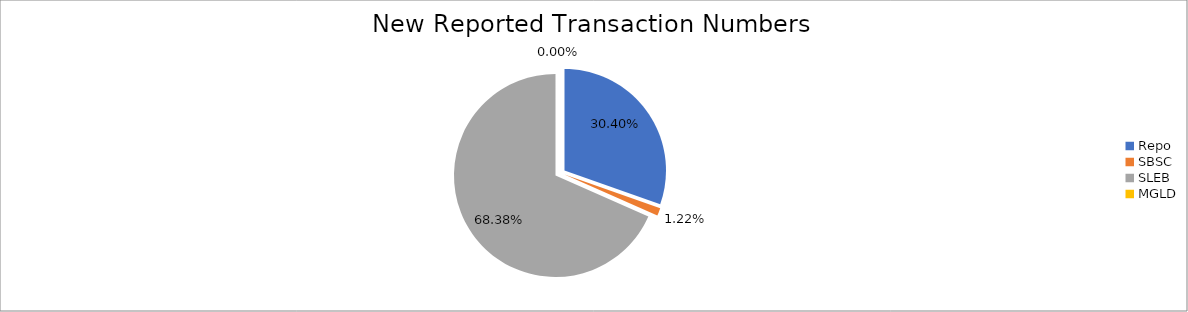
| Category | Series 0 |
|---|---|
| Repo | 266961 |
| SBSC | 10736 |
| SLEB | 600464 |
| MGLD | 4 |